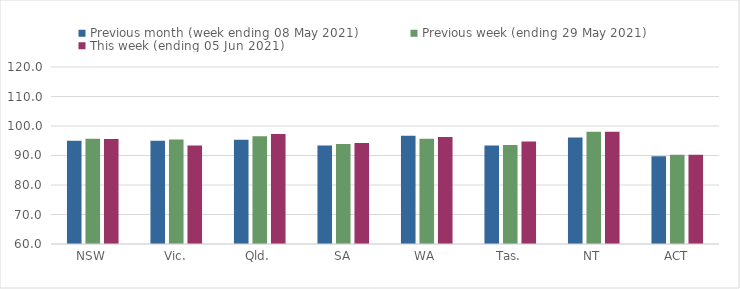
| Category | Previous month (week ending 08 May 2021) | Previous week (ending 29 May 2021) | This week (ending 05 Jun 2021) |
|---|---|---|---|
| NSW | 95 | 95.65 | 95.63 |
| Vic. | 94.96 | 95.41 | 93.37 |
| Qld. | 95.37 | 96.51 | 97.29 |
| SA | 93.35 | 93.89 | 94.22 |
| WA | 96.72 | 95.7 | 96.23 |
| Tas. | 93.43 | 93.53 | 94.74 |
| NT | 96.12 | 98.09 | 98.02 |
| ACT | 89.78 | 90.24 | 90.28 |